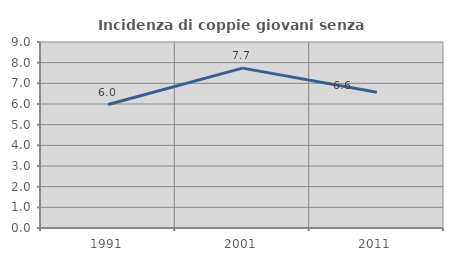
| Category | Incidenza di coppie giovani senza figli |
|---|---|
| 1991.0 | 5.974 |
| 2001.0 | 7.735 |
| 2011.0 | 6.57 |